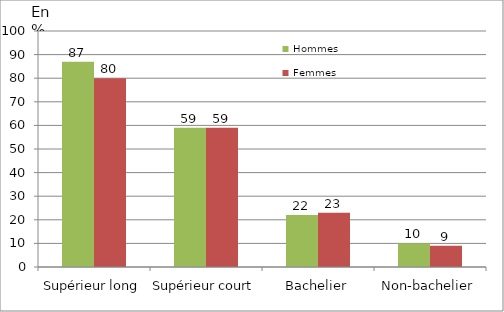
| Category | Hommes | Femmes |
|---|---|---|
| Supérieur long | 87 | 80 |
| Supérieur court | 59 | 59 |
| Bachelier | 22 | 23 |
| Non-bachelier | 10 | 9 |